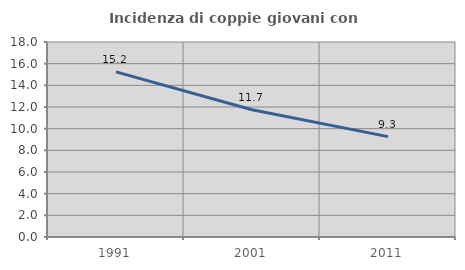
| Category | Incidenza di coppie giovani con figli |
|---|---|
| 1991.0 | 15.245 |
| 2001.0 | 11.749 |
| 2011.0 | 9.264 |